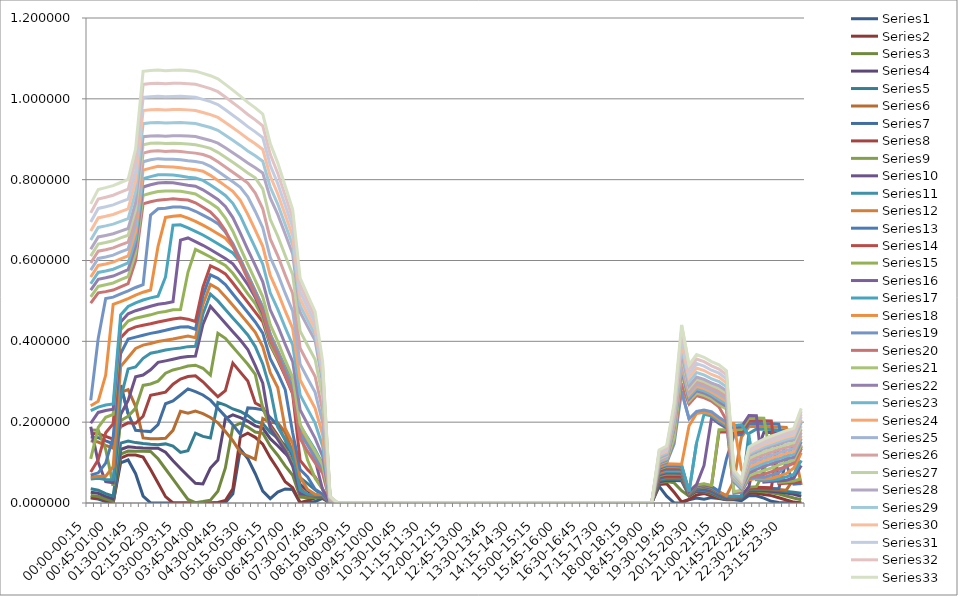
| Category | Series 0 | Series 1 | Series 2 | Series 3 | Series 4 | Series 5 | Series 6 | Series 7 | Series 8 | Series 9 | Series 10 | Series 11 | Series 12 | Series 13 | Series 14 | Series 15 | Series 16 | Series 17 | Series 18 | Series 19 | Series 20 | Series 21 | Series 22 | Series 23 | Series 24 | Series 25 | Series 26 | Series 27 | Series 28 | Series 29 | Series 30 | Series 31 | Series 32 |
|---|---|---|---|---|---|---|---|---|---|---|---|---|---|---|---|---|---|---|---|---|---|---|---|---|---|---|---|---|---|---|---|---|---|
| 00:00-00:15 | 0.013 | 0.014 | 0.019 | 0.027 | 0.035 | 0.154 | 0.163 | 0.172 | 0.181 | 0.189 | 0.059 | 0.064 | 0.069 | 0.077 | 0.109 | 0.197 | 0.228 | 0.241 | 0.254 | 0.495 | 0.51 | 0.527 | 0.542 | 0.559 | 0.576 | 0.594 | 0.611 | 0.628 | 0.65 | 0.673 | 0.695 | 0.718 | 0.74 |
| 00:15-00:30 | 0.01 | 0.014 | 0.016 | 0.024 | 0.032 | 0.151 | 0.162 | 0.171 | 0.18 | 0.101 | 0.061 | 0.066 | 0.075 | 0.107 | 0.187 | 0.224 | 0.237 | 0.252 | 0.407 | 0.52 | 0.536 | 0.554 | 0.571 | 0.588 | 0.605 | 0.623 | 0.641 | 0.658 | 0.682 | 0.705 | 0.729 | 0.752 | 0.776 |
| 00:30-00:45 | 0.004 | 0.007 | 0.01 | 0.017 | 0.023 | 0.143 | 0.154 | 0.165 | 0.133 | 0.053 | 0.058 | 0.066 | 0.099 | 0.174 | 0.212 | 0.229 | 0.242 | 0.317 | 0.506 | 0.523 | 0.54 | 0.557 | 0.574 | 0.592 | 0.609 | 0.627 | 0.644 | 0.662 | 0.686 | 0.709 | 0.733 | 0.757 | 0.78 |
| 00:45-01:00 | 0 | 0.001 | 0.004 | 0.01 | 0.017 | 0.135 | 0.147 | 0.158 | 0.042 | 0.05 | 0.057 | 0.09 | 0.163 | 0.196 | 0.219 | 0.232 | 0.245 | 0.492 | 0.509 | 0.527 | 0.544 | 0.561 | 0.578 | 0.596 | 0.613 | 0.631 | 0.649 | 0.666 | 0.69 | 0.714 | 0.738 | 0.761 | 0.785 |
| 01:00-01:15 | 0.1 | 0.111 | 0.121 | 0.132 | 0.148 | 0.274 | 0.292 | 0.189 | 0.204 | 0.219 | 0.259 | 0.338 | 0.37 | 0.409 | 0.429 | 0.448 | 0.465 | 0.498 | 0.517 | 0.535 | 0.552 | 0.569 | 0.586 | 0.604 | 0.621 | 0.639 | 0.656 | 0.673 | 0.697 | 0.721 | 0.745 | 0.769 | 0.793 |
| 01:15-01:30 | 0.106 | 0.119 | 0.128 | 0.139 | 0.154 | 0.28 | 0.221 | 0.198 | 0.215 | 0.254 | 0.332 | 0.36 | 0.406 | 0.428 | 0.45 | 0.468 | 0.486 | 0.506 | 0.525 | 0.543 | 0.56 | 0.577 | 0.594 | 0.612 | 0.628 | 0.646 | 0.662 | 0.679 | 0.703 | 0.728 | 0.752 | 0.776 | 0.801 |
| 01:30-01:45 | 0.073 | 0.119 | 0.128 | 0.137 | 0.149 | 0.239 | 0.18 | 0.197 | 0.235 | 0.312 | 0.337 | 0.382 | 0.41 | 0.436 | 0.457 | 0.476 | 0.495 | 0.514 | 0.533 | 0.6 | 0.618 | 0.636 | 0.654 | 0.672 | 0.69 | 0.708 | 0.726 | 0.744 | 0.77 | 0.797 | 0.823 | 0.85 | 0.876 |
| 01:45-02:00 | 0.017 | 0.114 | 0.128 | 0.136 | 0.147 | 0.161 | 0.178 | 0.215 | 0.291 | 0.317 | 0.358 | 0.391 | 0.415 | 0.44 | 0.461 | 0.481 | 0.502 | 0.522 | 0.54 | 0.74 | 0.761 | 0.782 | 0.802 | 0.823 | 0.844 | 0.866 | 0.887 | 0.906 | 0.939 | 0.971 | 1.003 | 1.036 | 1.068 |
| 02:00-02:15 | 0 | 0.083 | 0.127 | 0.136 | 0.145 | 0.159 | 0.177 | 0.267 | 0.294 | 0.33 | 0.371 | 0.395 | 0.42 | 0.443 | 0.466 | 0.487 | 0.508 | 0.527 | 0.712 | 0.745 | 0.767 | 0.787 | 0.808 | 0.829 | 0.849 | 0.87 | 0.89 | 0.908 | 0.941 | 0.973 | 1.005 | 1.038 | 1.07 |
| 02:15-02:30 | 0 | 0.049 | 0.109 | 0.136 | 0.144 | 0.159 | 0.194 | 0.27 | 0.302 | 0.348 | 0.374 | 0.4 | 0.423 | 0.448 | 0.471 | 0.492 | 0.512 | 0.635 | 0.728 | 0.749 | 0.771 | 0.792 | 0.812 | 0.833 | 0.852 | 0.871 | 0.891 | 0.909 | 0.941 | 0.974 | 1.006 | 1.039 | 1.071 |
| 02:30-02:45 | 0 | 0.016 | 0.084 | 0.126 | 0.146 | 0.16 | 0.246 | 0.274 | 0.321 | 0.352 | 0.378 | 0.403 | 0.427 | 0.451 | 0.474 | 0.494 | 0.559 | 0.707 | 0.729 | 0.751 | 0.772 | 0.793 | 0.812 | 0.832 | 0.851 | 0.87 | 0.889 | 0.908 | 0.94 | 0.973 | 1.005 | 1.037 | 1.07 |
| 02:45-03:00 | 0 | 0 | 0.059 | 0.105 | 0.141 | 0.18 | 0.252 | 0.294 | 0.329 | 0.356 | 0.381 | 0.406 | 0.432 | 0.455 | 0.478 | 0.498 | 0.687 | 0.71 | 0.732 | 0.752 | 0.772 | 0.792 | 0.811 | 0.831 | 0.851 | 0.871 | 0.89 | 0.909 | 0.941 | 0.974 | 1.006 | 1.038 | 1.071 |
| 03:00-03:15 | 0 | 0 | 0.034 | 0.085 | 0.125 | 0.227 | 0.267 | 0.307 | 0.334 | 0.36 | 0.384 | 0.409 | 0.436 | 0.458 | 0.479 | 0.651 | 0.688 | 0.711 | 0.732 | 0.751 | 0.771 | 0.789 | 0.809 | 0.83 | 0.849 | 0.869 | 0.89 | 0.909 | 0.941 | 0.974 | 1.006 | 1.039 | 1.071 |
| 03:15-03:30 | 0 | 0 | 0.009 | 0.067 | 0.129 | 0.222 | 0.282 | 0.313 | 0.339 | 0.362 | 0.387 | 0.413 | 0.436 | 0.455 | 0.571 | 0.656 | 0.681 | 0.705 | 0.729 | 0.75 | 0.768 | 0.786 | 0.806 | 0.827 | 0.847 | 0.868 | 0.888 | 0.908 | 0.94 | 0.973 | 1.005 | 1.038 | 1.07 |
| 03:30-03:45 | 0 | 0 | 0.001 | 0.049 | 0.173 | 0.227 | 0.275 | 0.315 | 0.341 | 0.363 | 0.388 | 0.409 | 0.43 | 0.449 | 0.628 | 0.647 | 0.672 | 0.697 | 0.722 | 0.743 | 0.764 | 0.784 | 0.804 | 0.825 | 0.845 | 0.866 | 0.887 | 0.907 | 0.939 | 0.971 | 1.004 | 1.036 | 1.068 |
| 03:45-04:00 | 0 | 0 | 0.004 | 0.047 | 0.165 | 0.221 | 0.267 | 0.3 | 0.333 | 0.442 | 0.467 | 0.491 | 0.513 | 0.534 | 0.618 | 0.638 | 0.663 | 0.687 | 0.712 | 0.732 | 0.754 | 0.775 | 0.798 | 0.821 | 0.842 | 0.862 | 0.882 | 0.902 | 0.934 | 0.966 | 0.999 | 1.031 | 1.063 |
| 04:00-04:15 | 0 | 0 | 0.007 | 0.086 | 0.161 | 0.212 | 0.255 | 0.281 | 0.316 | 0.486 | 0.517 | 0.541 | 0.564 | 0.587 | 0.609 | 0.627 | 0.653 | 0.677 | 0.702 | 0.72 | 0.742 | 0.763 | 0.787 | 0.811 | 0.833 | 0.856 | 0.877 | 0.897 | 0.929 | 0.961 | 0.993 | 1.025 | 1.057 |
| 04:15-04:30 | 0 | 0.002 | 0.029 | 0.106 | 0.249 | 0.198 | 0.235 | 0.263 | 0.42 | 0.466 | 0.5 | 0.531 | 0.556 | 0.578 | 0.598 | 0.616 | 0.642 | 0.666 | 0.691 | 0.701 | 0.729 | 0.751 | 0.774 | 0.798 | 0.821 | 0.844 | 0.868 | 0.89 | 0.922 | 0.954 | 0.986 | 1.018 | 1.049 |
| 04:30-04:45 | 0.001 | 0.006 | 0.087 | 0.209 | 0.242 | 0.177 | 0.214 | 0.278 | 0.408 | 0.445 | 0.479 | 0.51 | 0.541 | 0.567 | 0.587 | 0.605 | 0.63 | 0.655 | 0.67 | 0.674 | 0.705 | 0.734 | 0.761 | 0.785 | 0.808 | 0.832 | 0.855 | 0.879 | 0.91 | 0.942 | 0.973 | 1.004 | 1.036 |
| 04:45-05:00 | 0.023 | 0.035 | 0.189 | 0.218 | 0.233 | 0.154 | 0.193 | 0.346 | 0.386 | 0.424 | 0.458 | 0.489 | 0.517 | 0.544 | 0.568 | 0.592 | 0.619 | 0.634 | 0.642 | 0.636 | 0.672 | 0.706 | 0.741 | 0.771 | 0.795 | 0.819 | 0.843 | 0.867 | 0.898 | 0.929 | 0.96 | 0.99 | 1.021 |
| 05:00-05:15 | 0.133 | 0.164 | 0.198 | 0.211 | 0.226 | 0.125 | 0.17 | 0.324 | 0.365 | 0.403 | 0.437 | 0.467 | 0.494 | 0.52 | 0.544 | 0.567 | 0.597 | 0.604 | 0.603 | 0.595 | 0.631 | 0.668 | 0.71 | 0.749 | 0.781 | 0.805 | 0.83 | 0.854 | 0.885 | 0.915 | 0.946 | 0.976 | 1.007 |
| 05:15-05:30 | 0.11 | 0.173 | 0.188 | 0.203 | 0.216 | 0.116 | 0.236 | 0.302 | 0.343 | 0.38 | 0.416 | 0.445 | 0.471 | 0.496 | 0.518 | 0.541 | 0.565 | 0.564 | 0.561 | 0.554 | 0.59 | 0.627 | 0.67 | 0.714 | 0.757 | 0.792 | 0.817 | 0.841 | 0.871 | 0.901 | 0.931 | 0.961 | 0.991 |
| 05:30-05:45 | 0.072 | 0.162 | 0.176 | 0.191 | 0.202 | 0.108 | 0.234 | 0.247 | 0.318 | 0.34 | 0.387 | 0.422 | 0.448 | 0.472 | 0.493 | 0.508 | 0.525 | 0.524 | 0.522 | 0.514 | 0.551 | 0.588 | 0.631 | 0.675 | 0.721 | 0.767 | 0.804 | 0.829 | 0.859 | 0.889 | 0.918 | 0.948 | 0.978 |
| 05:45-06:00 | 0.029 | 0.145 | 0.173 | 0.185 | 0.197 | 0.209 | 0.23 | 0.237 | 0.235 | 0.297 | 0.344 | 0.386 | 0.42 | 0.448 | 0.458 | 0.468 | 0.484 | 0.484 | 0.482 | 0.474 | 0.51 | 0.547 | 0.591 | 0.635 | 0.681 | 0.728 | 0.777 | 0.816 | 0.846 | 0.875 | 0.904 | 0.933 | 0.962 |
| 06:00-06:15 | 0.011 | 0.112 | 0.141 | 0.159 | 0.175 | 0.199 | 0.212 | 0.194 | 0.188 | 0.185 | 0.281 | 0.322 | 0.357 | 0.39 | 0.394 | 0.403 | 0.418 | 0.417 | 0.414 | 0.405 | 0.441 | 0.478 | 0.52 | 0.563 | 0.608 | 0.653 | 0.702 | 0.755 | 0.782 | 0.809 | 0.836 | 0.863 | 0.89 |
| 06:15-06:30 | 0.027 | 0.084 | 0.118 | 0.142 | 0.16 | 0.198 | 0.192 | 0.167 | 0.163 | 0.157 | 0.188 | 0.286 | 0.321 | 0.354 | 0.358 | 0.367 | 0.378 | 0.376 | 0.373 | 0.364 | 0.4 | 0.438 | 0.48 | 0.522 | 0.567 | 0.612 | 0.661 | 0.714 | 0.74 | 0.765 | 0.791 | 0.816 | 0.842 |
| 06:30-06:45 | 0.035 | 0.053 | 0.092 | 0.123 | 0.143 | 0.174 | 0.156 | 0.135 | 0.133 | 0.129 | 0.156 | 0.185 | 0.281 | 0.314 | 0.319 | 0.328 | 0.336 | 0.33 | 0.327 | 0.317 | 0.353 | 0.393 | 0.434 | 0.475 | 0.519 | 0.564 | 0.612 | 0.665 | 0.689 | 0.713 | 0.737 | 0.761 | 0.784 |
| 06:45-07:00 | 0.033 | 0.038 | 0.069 | 0.103 | 0.124 | 0.126 | 0.114 | 0.097 | 0.097 | 0.091 | 0.124 | 0.148 | 0.174 | 0.27 | 0.276 | 0.286 | 0.3 | 0.291 | 0.284 | 0.273 | 0.311 | 0.35 | 0.391 | 0.432 | 0.475 | 0.518 | 0.565 | 0.616 | 0.638 | 0.66 | 0.682 | 0.704 | 0.726 |
| 07:00-07:15 | 0 | 0.001 | 0.014 | 0.046 | 0.062 | 0.038 | 0.031 | 0.022 | 0.022 | 0.022 | 0.032 | 0.064 | 0.083 | 0.105 | 0.174 | 0.183 | 0.191 | 0.185 | 0.173 | 0.159 | 0.194 | 0.23 | 0.268 | 0.304 | 0.344 | 0.383 | 0.425 | 0.472 | 0.489 | 0.506 | 0.523 | 0.54 | 0.556 |
| 07:15-07:30 | 0 | 0.006 | 0.013 | 0.03 | 0.048 | 0.018 | 0.019 | 0.02 | 0.021 | 0.021 | 0.022 | 0.033 | 0.065 | 0.083 | 0.106 | 0.153 | 0.161 | 0.152 | 0.143 | 0.128 | 0.159 | 0.195 | 0.232 | 0.269 | 0.308 | 0.347 | 0.39 | 0.436 | 0.452 | 0.468 | 0.483 | 0.499 | 0.514 |
| 07:30-07:45 | 0.004 | 0.012 | 0.014 | 0.016 | 0.033 | 0.017 | 0.017 | 0.018 | 0.019 | 0.02 | 0.021 | 0.021 | 0.034 | 0.065 | 0.061 | 0.107 | 0.132 | 0.122 | 0.112 | 0.099 | 0.128 | 0.16 | 0.198 | 0.234 | 0.274 | 0.313 | 0.355 | 0.402 | 0.416 | 0.431 | 0.445 | 0.459 | 0.474 |
| 07:45-08:00 | 0.011 | 0.013 | 0.014 | 0.015 | 0.019 | 0.017 | 0.017 | 0.018 | 0.019 | 0.02 | 0.021 | 0.021 | 0.022 | 0.035 | 0.034 | 0.033 | 0.097 | 0.089 | 0.08 | 0.074 | 0.095 | 0.116 | 0.141 | 0.169 | 0.199 | 0.23 | 0.262 | 0.298 | 0.309 | 0.319 | 0.33 | 0.341 | 0.351 |
| 08:00-08:15 | 0 | 0 | 0 | 0 | 0 | 0 | 0 | 0 | 0 | 0 | 0 | 0 | 0 | 0 | 0 | 0 | 0.004 | 0.004 | 0.003 | 0.003 | 0.004 | 0.005 | 0.006 | 0.007 | 0.009 | 0.01 | 0.012 | 0.014 | 0.014 | 0.015 | 0.015 | 0.016 | 0.016 |
| 08:15-08:30 | 0 | 0 | 0 | 0 | 0 | 0 | 0 | 0 | 0 | 0 | 0 | 0 | 0 | 0 | 0 | 0 | 0 | 0 | 0 | 0 | 0 | 0 | 0 | 0 | 0 | 0 | 0 | 0 | 0 | 0 | 0 | 0 | 0 |
| 08:30-08:45 | 0 | 0 | 0 | 0 | 0 | 0 | 0 | 0 | 0 | 0 | 0 | 0 | 0 | 0 | 0 | 0 | 0 | 0 | 0 | 0 | 0 | 0 | 0 | 0 | 0 | 0 | 0 | 0 | 0 | 0 | 0 | 0 | 0 |
| 08:45-09:00 | 0 | 0 | 0 | 0 | 0 | 0 | 0 | 0 | 0 | 0 | 0 | 0 | 0 | 0 | 0 | 0 | 0 | 0 | 0 | 0 | 0 | 0 | 0 | 0 | 0 | 0 | 0 | 0 | 0 | 0 | 0 | 0 | 0 |
| 09:00-09:15 | 0 | 0 | 0 | 0 | 0 | 0 | 0 | 0 | 0 | 0 | 0 | 0 | 0 | 0 | 0 | 0 | 0 | 0 | 0 | 0 | 0 | 0 | 0 | 0 | 0 | 0 | 0 | 0 | 0 | 0 | 0 | 0 | 0 |
| 09:15-09:30 | 0 | 0 | 0 | 0 | 0 | 0 | 0 | 0 | 0 | 0 | 0 | 0 | 0 | 0 | 0 | 0 | 0 | 0 | 0 | 0 | 0 | 0 | 0 | 0 | 0 | 0 | 0 | 0 | 0 | 0 | 0 | 0 | 0 |
| 09:30-09:45 | 0 | 0 | 0 | 0 | 0 | 0 | 0 | 0 | 0 | 0 | 0 | 0 | 0 | 0 | 0 | 0 | 0 | 0 | 0 | 0 | 0 | 0 | 0 | 0 | 0 | 0 | 0 | 0 | 0 | 0 | 0 | 0 | 0 |
| 09:45-10:00 | 0 | 0 | 0 | 0 | 0 | 0 | 0 | 0 | 0 | 0 | 0 | 0 | 0 | 0 | 0 | 0 | 0 | 0 | 0 | 0 | 0 | 0 | 0 | 0 | 0 | 0 | 0 | 0 | 0 | 0 | 0 | 0 | 0 |
| 10:00-10:15 | 0 | 0 | 0 | 0 | 0 | 0 | 0 | 0 | 0 | 0 | 0 | 0 | 0 | 0 | 0 | 0 | 0 | 0 | 0 | 0 | 0 | 0 | 0 | 0 | 0 | 0 | 0 | 0 | 0 | 0 | 0 | 0 | 0 |
| 10:15-10:30 | 0 | 0 | 0 | 0 | 0 | 0 | 0 | 0 | 0 | 0 | 0 | 0 | 0 | 0 | 0 | 0 | 0 | 0 | 0 | 0 | 0 | 0 | 0 | 0 | 0 | 0 | 0 | 0 | 0 | 0 | 0 | 0 | 0 |
| 10:30-10:45 | 0 | 0 | 0 | 0 | 0 | 0 | 0 | 0 | 0 | 0 | 0 | 0 | 0 | 0 | 0 | 0 | 0 | 0 | 0 | 0 | 0 | 0 | 0 | 0 | 0 | 0 | 0 | 0 | 0 | 0 | 0 | 0 | 0 |
| 10:45-11:00 | 0 | 0 | 0 | 0 | 0 | 0 | 0 | 0 | 0 | 0 | 0 | 0 | 0 | 0 | 0 | 0 | 0 | 0 | 0 | 0 | 0 | 0 | 0 | 0 | 0 | 0 | 0 | 0 | 0 | 0 | 0 | 0 | 0 |
| 11:00-11:15 | 0 | 0 | 0 | 0 | 0 | 0 | 0 | 0 | 0 | 0 | 0 | 0 | 0 | 0 | 0 | 0 | 0 | 0 | 0 | 0 | 0 | 0 | 0 | 0 | 0 | 0 | 0 | 0 | 0 | 0 | 0 | 0 | 0 |
| 11:15-11:30 | 0 | 0 | 0 | 0 | 0 | 0 | 0 | 0 | 0 | 0 | 0 | 0 | 0 | 0 | 0 | 0 | 0 | 0 | 0 | 0 | 0 | 0 | 0 | 0 | 0 | 0 | 0 | 0 | 0 | 0 | 0 | 0 | 0 |
| 11:30-11:45 | 0 | 0 | 0 | 0 | 0 | 0 | 0 | 0 | 0 | 0 | 0 | 0 | 0 | 0 | 0 | 0 | 0 | 0 | 0 | 0 | 0 | 0 | 0 | 0 | 0 | 0 | 0 | 0 | 0 | 0 | 0 | 0 | 0 |
| 11:45-12:00 | 0 | 0 | 0 | 0 | 0 | 0 | 0 | 0 | 0 | 0 | 0 | 0 | 0 | 0 | 0 | 0 | 0 | 0 | 0 | 0 | 0 | 0 | 0 | 0 | 0 | 0 | 0 | 0 | 0 | 0 | 0 | 0 | 0 |
| 12:00-12:15 | 0 | 0 | 0 | 0 | 0 | 0 | 0 | 0 | 0 | 0 | 0 | 0 | 0 | 0 | 0 | 0 | 0 | 0 | 0 | 0 | 0 | 0 | 0 | 0 | 0 | 0 | 0 | 0 | 0 | 0 | 0 | 0 | 0 |
| 12:15-12:30 | 0 | 0 | 0 | 0 | 0 | 0 | 0 | 0 | 0 | 0 | 0 | 0 | 0 | 0 | 0 | 0 | 0 | 0 | 0 | 0 | 0 | 0 | 0 | 0 | 0 | 0 | 0 | 0 | 0 | 0 | 0 | 0 | 0 |
| 12:30-12:45 | 0 | 0 | 0 | 0 | 0 | 0 | 0 | 0 | 0 | 0 | 0 | 0 | 0 | 0 | 0 | 0 | 0 | 0 | 0 | 0 | 0 | 0 | 0 | 0 | 0 | 0 | 0 | 0 | 0 | 0 | 0 | 0 | 0 |
| 12:45-13:00 | 0 | 0 | 0 | 0 | 0 | 0 | 0 | 0 | 0 | 0 | 0 | 0 | 0 | 0 | 0 | 0 | 0 | 0 | 0 | 0 | 0 | 0 | 0 | 0 | 0 | 0 | 0 | 0 | 0 | 0 | 0 | 0 | 0 |
| 13:00-13:15 | 0 | 0 | 0 | 0 | 0 | 0 | 0 | 0 | 0 | 0 | 0 | 0 | 0 | 0 | 0 | 0 | 0 | 0 | 0 | 0 | 0 | 0 | 0 | 0 | 0 | 0 | 0 | 0 | 0 | 0 | 0 | 0 | 0 |
| 13:15-13:30 | 0 | 0 | 0 | 0 | 0 | 0 | 0 | 0 | 0 | 0 | 0 | 0 | 0 | 0 | 0 | 0 | 0 | 0 | 0 | 0 | 0 | 0 | 0 | 0 | 0 | 0 | 0 | 0 | 0 | 0 | 0 | 0 | 0 |
| 13:30-13:45 | 0 | 0 | 0 | 0 | 0 | 0 | 0 | 0 | 0 | 0 | 0 | 0 | 0 | 0 | 0 | 0 | 0 | 0 | 0 | 0 | 0 | 0 | 0 | 0 | 0 | 0 | 0 | 0 | 0 | 0 | 0 | 0 | 0 |
| 13:45-14:00 | 0 | 0 | 0 | 0 | 0 | 0 | 0 | 0 | 0 | 0 | 0 | 0 | 0 | 0 | 0 | 0 | 0 | 0 | 0 | 0 | 0 | 0 | 0 | 0 | 0 | 0 | 0 | 0 | 0 | 0 | 0 | 0 | 0 |
| 14:00-14:15 | 0 | 0 | 0 | 0 | 0 | 0 | 0 | 0 | 0 | 0 | 0 | 0 | 0 | 0 | 0 | 0 | 0 | 0 | 0 | 0 | 0 | 0 | 0 | 0 | 0 | 0 | 0 | 0 | 0 | 0 | 0 | 0 | 0 |
| 14:15-14:30 | 0 | 0 | 0 | 0 | 0 | 0 | 0 | 0 | 0 | 0 | 0 | 0 | 0 | 0 | 0 | 0 | 0 | 0 | 0 | 0 | 0 | 0 | 0 | 0 | 0 | 0 | 0 | 0 | 0 | 0 | 0 | 0 | 0 |
| 14:30-14:45 | 0 | 0 | 0 | 0 | 0 | 0 | 0 | 0 | 0 | 0 | 0 | 0 | 0 | 0 | 0 | 0 | 0 | 0 | 0 | 0 | 0 | 0 | 0 | 0 | 0 | 0 | 0 | 0 | 0 | 0 | 0 | 0 | 0 |
| 14:45-15:00 | 0 | 0 | 0 | 0 | 0 | 0 | 0 | 0 | 0 | 0 | 0 | 0 | 0 | 0 | 0 | 0 | 0 | 0 | 0 | 0 | 0 | 0 | 0 | 0 | 0 | 0 | 0 | 0 | 0 | 0 | 0 | 0 | 0 |
| 15:00-15:15 | 0 | 0 | 0 | 0 | 0 | 0 | 0 | 0 | 0 | 0 | 0 | 0 | 0 | 0 | 0 | 0 | 0 | 0 | 0 | 0 | 0 | 0 | 0 | 0 | 0 | 0 | 0 | 0 | 0 | 0 | 0 | 0 | 0 |
| 15:15-15:30 | 0 | 0 | 0 | 0 | 0 | 0 | 0 | 0 | 0 | 0 | 0 | 0 | 0 | 0 | 0 | 0 | 0 | 0 | 0 | 0 | 0 | 0 | 0 | 0 | 0 | 0 | 0 | 0 | 0 | 0 | 0 | 0 | 0 |
| 15:30-15:45 | 0 | 0 | 0 | 0 | 0 | 0 | 0 | 0 | 0 | 0 | 0 | 0 | 0 | 0 | 0 | 0 | 0 | 0 | 0 | 0 | 0 | 0 | 0 | 0 | 0 | 0 | 0 | 0 | 0 | 0 | 0 | 0 | 0 |
| 15:45-16:00 | 0 | 0 | 0 | 0 | 0 | 0 | 0 | 0 | 0 | 0 | 0 | 0 | 0 | 0 | 0 | 0 | 0 | 0 | 0 | 0 | 0 | 0 | 0 | 0 | 0 | 0 | 0 | 0 | 0 | 0 | 0 | 0 | 0 |
| 16:00-16:15 | 0 | 0 | 0 | 0 | 0 | 0 | 0 | 0 | 0 | 0 | 0 | 0 | 0 | 0 | 0 | 0 | 0 | 0 | 0 | 0 | 0 | 0 | 0 | 0 | 0 | 0 | 0 | 0 | 0 | 0 | 0 | 0 | 0 |
| 16:15-16:30 | 0 | 0 | 0 | 0 | 0 | 0 | 0 | 0 | 0 | 0 | 0 | 0 | 0 | 0 | 0 | 0 | 0 | 0 | 0 | 0 | 0 | 0 | 0 | 0 | 0 | 0 | 0 | 0 | 0 | 0 | 0 | 0 | 0 |
| 16:30-16:45 | 0 | 0 | 0 | 0 | 0 | 0 | 0 | 0 | 0 | 0 | 0 | 0 | 0 | 0 | 0 | 0 | 0 | 0 | 0 | 0 | 0 | 0 | 0 | 0 | 0 | 0 | 0 | 0 | 0 | 0 | 0 | 0 | 0 |
| 16:45-17:00 | 0 | 0 | 0 | 0 | 0 | 0 | 0 | 0 | 0 | 0 | 0 | 0 | 0 | 0 | 0 | 0 | 0 | 0 | 0 | 0 | 0 | 0 | 0 | 0 | 0 | 0 | 0 | 0 | 0 | 0 | 0 | 0 | 0 |
| 17:00-17:15 | 0 | 0 | 0 | 0 | 0 | 0 | 0 | 0 | 0 | 0 | 0 | 0 | 0 | 0 | 0 | 0 | 0 | 0 | 0 | 0 | 0 | 0 | 0 | 0 | 0 | 0 | 0 | 0 | 0 | 0 | 0 | 0 | 0 |
| 17:15-17:30 | 0 | 0 | 0 | 0 | 0 | 0 | 0 | 0 | 0 | 0 | 0 | 0 | 0 | 0 | 0 | 0 | 0 | 0 | 0 | 0 | 0 | 0 | 0 | 0 | 0 | 0 | 0 | 0 | 0 | 0 | 0 | 0 | 0 |
| 17:30-17:45 | 0 | 0 | 0 | 0 | 0 | 0 | 0 | 0 | 0 | 0 | 0 | 0 | 0 | 0 | 0 | 0 | 0 | 0 | 0 | 0 | 0 | 0 | 0 | 0 | 0 | 0 | 0 | 0 | 0 | 0 | 0 | 0 | 0 |
| 17:45-18:00 | 0 | 0 | 0 | 0 | 0 | 0 | 0 | 0 | 0 | 0 | 0 | 0 | 0 | 0 | 0 | 0 | 0 | 0 | 0 | 0 | 0 | 0 | 0 | 0 | 0 | 0 | 0 | 0 | 0 | 0 | 0 | 0 | 0 |
| 18:00-18:15 | 0 | 0 | 0 | 0 | 0 | 0 | 0 | 0 | 0 | 0 | 0 | 0 | 0 | 0 | 0 | 0 | 0 | 0 | 0 | 0 | 0 | 0 | 0 | 0 | 0 | 0 | 0 | 0 | 0 | 0 | 0 | 0 | 0 |
| 18:15-18:30 | 0 | 0 | 0 | 0 | 0 | 0 | 0 | 0 | 0 | 0 | 0 | 0 | 0 | 0 | 0 | 0 | 0 | 0 | 0 | 0 | 0 | 0 | 0 | 0 | 0 | 0 | 0 | 0 | 0 | 0 | 0 | 0 | 0 |
| 18:30-18:45 | 0 | 0 | 0 | 0 | 0 | 0 | 0 | 0 | 0 | 0 | 0 | 0 | 0 | 0 | 0 | 0 | 0 | 0 | 0 | 0 | 0 | 0 | 0 | 0 | 0 | 0 | 0 | 0 | 0 | 0 | 0 | 0 | 0 |
| 18:45-19:00 | 0 | 0 | 0 | 0 | 0 | 0 | 0 | 0 | 0 | 0 | 0 | 0 | 0 | 0 | 0 | 0 | 0 | 0 | 0 | 0 | 0 | 0 | 0 | 0 | 0 | 0 | 0 | 0 | 0 | 0 | 0 | 0 | 0 |
| 19:00-19:15 | 0.041 | 0.046 | 0.049 | 0.052 | 0.056 | 0.058 | 0.061 | 0.064 | 0.067 | 0.07 | 0.073 | 0.075 | 0.078 | 0.081 | 0.084 | 0.086 | 0.088 | 0.09 | 0.093 | 0.095 | 0.097 | 0.099 | 0.101 | 0.103 | 0.105 | 0.107 | 0.109 | 0.111 | 0.115 | 0.119 | 0.123 | 0.127 | 0.131 |
| 19:15-19:30 | 0.017 | 0.048 | 0.053 | 0.056 | 0.059 | 0.063 | 0.066 | 0.069 | 0.072 | 0.075 | 0.078 | 0.081 | 0.084 | 0.087 | 0.09 | 0.092 | 0.095 | 0.097 | 0.099 | 0.102 | 0.104 | 0.106 | 0.108 | 0.111 | 0.113 | 0.115 | 0.118 | 0.12 | 0.124 | 0.128 | 0.133 | 0.137 | 0.141 |
| 19:30-19:45 | 0.001 | 0.027 | 0.05 | 0.056 | 0.059 | 0.062 | 0.065 | 0.068 | 0.071 | 0.074 | 0.078 | 0.081 | 0.084 | 0.087 | 0.09 | 0.092 | 0.094 | 0.097 | 0.147 | 0.157 | 0.161 | 0.185 | 0.189 | 0.193 | 0.197 | 0.201 | 0.205 | 0.209 | 0.217 | 0.224 | 0.231 | 0.239 | 0.246 |
| 19:45-20:00 | 0 | 0.003 | 0.03 | 0.055 | 0.059 | 0.062 | 0.065 | 0.068 | 0.071 | 0.074 | 0.077 | 0.08 | 0.083 | 0.086 | 0.089 | 0.091 | 0.094 | 0.096 | 0.277 | 0.296 | 0.323 | 0.331 | 0.338 | 0.345 | 0.352 | 0.36 | 0.367 | 0.374 | 0.387 | 0.401 | 0.414 | 0.427 | 0.441 |
| 20:00-20:15 | 0.008 | 0.009 | 0.017 | 0.018 | 0.019 | 0.02 | 0.021 | 0.022 | 0.023 | 0.023 | 0.024 | 0.025 | 0.026 | 0.027 | 0.027 | 0.028 | 0.029 | 0.191 | 0.208 | 0.245 | 0.252 | 0.257 | 0.263 | 0.268 | 0.273 | 0.279 | 0.285 | 0.29 | 0.3 | 0.31 | 0.321 | 0.331 | 0.341 |
| 20:15-20:30 | 0.012 | 0.02 | 0.029 | 0.03 | 0.032 | 0.033 | 0.035 | 0.036 | 0.037 | 0.038 | 0.04 | 0.041 | 0.042 | 0.044 | 0.045 | 0.046 | 0.148 | 0.221 | 0.227 | 0.266 | 0.271 | 0.277 | 0.283 | 0.289 | 0.294 | 0.3 | 0.306 | 0.312 | 0.323 | 0.334 | 0.345 | 0.356 | 0.367 |
| 20:30-20:45 | 0.009 | 0.024 | 0.028 | 0.029 | 0.03 | 0.032 | 0.033 | 0.038 | 0.039 | 0.041 | 0.042 | 0.044 | 0.045 | 0.046 | 0.048 | 0.093 | 0.219 | 0.225 | 0.23 | 0.26 | 0.266 | 0.272 | 0.277 | 0.283 | 0.289 | 0.295 | 0.3 | 0.306 | 0.317 | 0.328 | 0.339 | 0.35 | 0.361 |
| 20:45-21:00 | 0.013 | 0.017 | 0.023 | 0.024 | 0.026 | 0.027 | 0.028 | 0.034 | 0.035 | 0.036 | 0.038 | 0.039 | 0.041 | 0.042 | 0.044 | 0.21 | 0.215 | 0.22 | 0.226 | 0.252 | 0.258 | 0.263 | 0.269 | 0.274 | 0.28 | 0.286 | 0.291 | 0.297 | 0.307 | 0.318 | 0.329 | 0.339 | 0.35 |
| 21:00-21:15 | 0.011 | 0.012 | 0.015 | 0.016 | 0.017 | 0.018 | 0.019 | 0.024 | 0.025 | 0.026 | 0.027 | 0.028 | 0.029 | 0.175 | 0.181 | 0.197 | 0.202 | 0.207 | 0.212 | 0.238 | 0.243 | 0.25 | 0.256 | 0.263 | 0.27 | 0.277 | 0.283 | 0.29 | 0.3 | 0.311 | 0.321 | 0.332 | 0.342 |
| 21:15-21:30 | 0.008 | 0.009 | 0.01 | 0.01 | 0.011 | 0.011 | 0.011 | 0.016 | 0.016 | 0.017 | 0.017 | 0.018 | 0.109 | 0.175 | 0.181 | 0.186 | 0.19 | 0.195 | 0.2 | 0.205 | 0.232 | 0.239 | 0.245 | 0.252 | 0.258 | 0.265 | 0.271 | 0.278 | 0.288 | 0.298 | 0.307 | 0.317 | 0.327 |
| 21:30-21:45 | 0.008 | 0.011 | 0.011 | 0.012 | 0.013 | 0.013 | 0.014 | 0.014 | 0.015 | 0.015 | 0.016 | 0.055 | 0.167 | 0.173 | 0.182 | 0.187 | 0.192 | 0.196 | 0.024 | 0.026 | 0.028 | 0.052 | 0.055 | 0.058 | 0.061 | 0.064 | 0.066 | 0.069 | 0.072 | 0.074 | 0.077 | 0.079 | 0.082 |
| 21:45-22:00 | 0.005 | 0.011 | 0.013 | 0.013 | 0.014 | 0.015 | 0.015 | 0.016 | 0.016 | 0.017 | 0.017 | 0.163 | 0.169 | 0.175 | 0.182 | 0.189 | 0.194 | 0.083 | 0.027 | 0.029 | 0.032 | 0.035 | 0.037 | 0.04 | 0.042 | 0.045 | 0.047 | 0.05 | 0.052 | 0.054 | 0.055 | 0.057 | 0.059 |
| 22:00-22:15 | 0.018 | 0.026 | 0.03 | 0.031 | 0.033 | 0.035 | 0.036 | 0.038 | 0.039 | 0.041 | 0.172 | 0.189 | 0.196 | 0.203 | 0.209 | 0.217 | 0.167 | 0.057 | 0.06 | 0.063 | 0.067 | 0.075 | 0.082 | 0.089 | 0.096 | 0.103 | 0.11 | 0.118 | 0.122 | 0.126 | 0.13 | 0.134 | 0.139 |
| 22:15-22:30 | 0.018 | 0.024 | 0.029 | 0.032 | 0.034 | 0.036 | 0.037 | 0.039 | 0.04 | 0.122 | 0.183 | 0.19 | 0.197 | 0.204 | 0.211 | 0.216 | 0.057 | 0.06 | 0.064 | 0.068 | 0.075 | 0.083 | 0.09 | 0.097 | 0.105 | 0.112 | 0.119 | 0.126 | 0.131 | 0.135 | 0.14 | 0.144 | 0.149 |
| 22:30-22:45 | 0.012 | 0.021 | 0.027 | 0.031 | 0.033 | 0.035 | 0.036 | 0.038 | 0.074 | 0.175 | 0.182 | 0.189 | 0.196 | 0.203 | 0.21 | 0.052 | 0.055 | 0.059 | 0.064 | 0.071 | 0.08 | 0.091 | 0.098 | 0.105 | 0.112 | 0.12 | 0.127 | 0.134 | 0.139 | 0.144 | 0.149 | 0.153 | 0.158 |
| 22:45-23:00 | 0.004 | 0.018 | 0.025 | 0.029 | 0.032 | 0.034 | 0.036 | 0.038 | 0.168 | 0.175 | 0.182 | 0.188 | 0.196 | 0.203 | 0.103 | 0.053 | 0.057 | 0.061 | 0.069 | 0.077 | 0.086 | 0.097 | 0.104 | 0.111 | 0.118 | 0.126 | 0.133 | 0.14 | 0.145 | 0.15 | 0.155 | 0.16 | 0.165 |
| 23:00-23:15 | 0.001 | 0.013 | 0.022 | 0.027 | 0.031 | 0.033 | 0.035 | 0.152 | 0.167 | 0.174 | 0.181 | 0.188 | 0.195 | 0.048 | 0.051 | 0.054 | 0.059 | 0.067 | 0.075 | 0.084 | 0.094 | 0.103 | 0.11 | 0.117 | 0.124 | 0.132 | 0.139 | 0.146 | 0.151 | 0.157 | 0.162 | 0.167 | 0.172 |
| 23:15-23:30 | 0.001 | 0.007 | 0.017 | 0.025 | 0.029 | 0.032 | 0.105 | 0.159 | 0.167 | 0.173 | 0.18 | 0.187 | 0.095 | 0.049 | 0.052 | 0.057 | 0.065 | 0.073 | 0.093 | 0.09 | 0.1 | 0.108 | 0.116 | 0.123 | 0.13 | 0.137 | 0.145 | 0.152 | 0.158 | 0.163 | 0.168 | 0.174 | 0.179 |
| 23:30-23:45 | 0 | 0.002 | 0.012 | 0.021 | 0.027 | 0.06 | 0.15 | 0.158 | 0.166 | 0.173 | 0.18 | 0.139 | 0.046 | 0.05 | 0.054 | 0.062 | 0.071 | 0.087 | 0.1 | 0.098 | 0.106 | 0.113 | 0.12 | 0.127 | 0.135 | 0.142 | 0.149 | 0.157 | 0.162 | 0.168 | 0.174 | 0.179 | 0.185 |
| 23:45-00:00 | 0 | 0 | 0.008 | 0.017 | 0.024 | 0.141 | 0.149 | 0.157 | 0.165 | 0.172 | 0.18 | 0.044 | 0.048 | 0.052 | 0.06 | 0.093 | 0.105 | 0.124 | 0.134 | 0.135 | 0.144 | 0.151 | 0.159 | 0.167 | 0.175 | 0.183 | 0.19 | 0.199 | 0.206 | 0.213 | 0.22 | 0.227 | 0.234 |